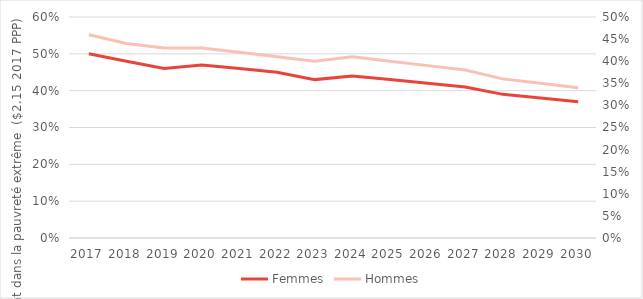
| Category | Femmes |
|---|---|
| 2017 | 0.5 |
| 2018 | 0.48 |
| 2019 | 0.46 |
| 2020 | 0.47 |
| 2021 | 0.46 |
| 2022 | 0.45 |
| 2023 | 0.43 |
| 2024 | 0.44 |
| 2025 | 0.43 |
| 2026 | 0.42 |
| 2027 | 0.41 |
| 2028 | 0.39 |
| 2029 | 0.38 |
| 2030 | 0.37 |